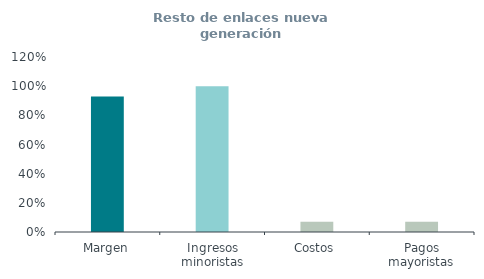
| Category | Resto de enlaces nueva generación
(% ingresos) |
|---|---|
| Margen | 0.929 |
| Ingresos minoristas | 1 |
| Costos | 0.071 |
| Pagos mayoristas | 0.071 |